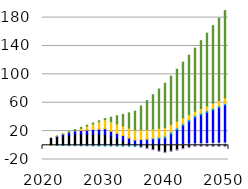
| Category | biomass | coal | hydro | natural gas | nuclear | resid | solar | waste | wind |
|---|---|---|---|---|---|---|---|---|---|
| 2020.0 | 0 | 0 | 0 | 0 | 0 | 0 | 0 | 0 | 0 |
| 2021.0 | -0.135 | 9.963 | 0 | 0 | 0 | 0 | -0.001 | 0 | 0 |
| 2022.0 | -0.102 | 11.498 | 1.099 | -0.141 | 0 | 0 | 0.058 | 0 | 0.353 |
| 2023.0 | -0.068 | 13.033 | 2.198 | -0.282 | 0 | 0 | 0.118 | 0 | 0.706 |
| 2024.0 | -0.034 | 14.568 | 3.297 | -0.423 | 0 | 0 | 0.177 | 0 | 1.059 |
| 2025.0 | 0 | 16.103 | 4.395 | -0.564 | 0 | 0 | 0.236 | 0 | 1.412 |
| 2026.0 | 0.153 | 15.902 | 5.03 | -0.647 | 0 | 0.06 | 2.698 | 0 | 1.391 |
| 2027.0 | 0.306 | 15.7 | 5.665 | -0.731 | 0 | 0.12 | 5.159 | 0 | 1.371 |
| 2028.0 | 0.46 | 15.499 | 6.3 | -0.814 | 0 | 0.18 | 7.62 | 0 | 1.35 |
| 2029.0 | 0.613 | 15.298 | 6.935 | -0.897 | 0 | 0.24 | 10.082 | 0 | 1.329 |
| 2030.0 | 0.766 | 15.097 | 7.569 | -0.981 | 0 | 0.3 | 12.543 | 0 | 1.308 |
| 2031.0 | 0.808 | 12.003 | 7.392 | -1.046 | 0.031 | 0.24 | 12.838 | 0 | 6.299 |
| 2032.0 | 0.85 | 8.909 | 7.215 | -1.111 | 0.063 | 0.18 | 13.133 | 0 | 11.289 |
| 2033.0 | 0.891 | 5.815 | 7.038 | -1.177 | 0.094 | 0.12 | 13.428 | 0 | 16.279 |
| 2034.0 | 0.933 | 2.721 | 6.861 | -1.242 | 0.125 | 0.06 | 13.723 | 0 | 21.269 |
| 2035.0 | 0.975 | -0.374 | 6.684 | -1.307 | 0.157 | 0 | 14.018 | 0 | 26.259 |
| 2036.0 | 1.103 | -2.274 | 7.03 | -0.469 | 0.125 | 0 | 13.611 | -0.105 | 33.525 |
| 2037.0 | 1.232 | -4.175 | 7.375 | 0.37 | 0.094 | 0 | 13.204 | -0.209 | 40.791 |
| 2038.0 | 1.361 | -6.076 | 7.72 | 1.208 | 0.063 | 0 | 12.798 | -0.314 | 48.056 |
| 2039.0 | 1.49 | -7.977 | 8.065 | 2.046 | 0.031 | 0 | 12.391 | -0.419 | 55.322 |
| 2040.0 | 1.619 | -9.877 | 8.411 | 2.885 | 0 | 0 | 11.985 | -0.523 | 62.587 |
| 2041.0 | 1.963 | -8.08 | 13.959 | 2.822 | 0 | 0 | 10.781 | -0.549 | 67.843 |
| 2042.0 | 2.308 | -6.284 | 19.507 | 2.76 | 0 | 0 | 9.577 | -0.576 | 73.098 |
| 2043.0 | 2.652 | -4.487 | 25.056 | 2.697 | 0 | 0 | 8.374 | -0.602 | 78.353 |
| 2044.0 | 2.997 | -2.69 | 30.604 | 2.634 | 0 | 0 | 7.17 | -0.628 | 83.609 |
| 2045.0 | 3.341 | -0.893 | 36.152 | 2.572 | 0 | 0 | 5.966 | -0.654 | 88.864 |
| 2046.0 | 3.635 | -0.928 | 39.271 | 2.51 | 0 | 0 | 6.392 | -0.68 | 95.681 |
| 2047.0 | 3.929 | -0.964 | 42.39 | 2.448 | 0 | 0 | 6.817 | -0.706 | 102.498 |
| 2048.0 | 4.223 | -0.999 | 45.508 | 2.386 | 0 | 0 | 7.243 | -0.732 | 109.315 |
| 2049.0 | 4.517 | -1.034 | 48.627 | 2.323 | 0 | 0 | 7.668 | -0.758 | 116.132 |
| 2050.0 | 4.81 | -1.07 | 51.746 | 2.261 | 0 | 0 | 8.094 | -0.784 | 122.949 |